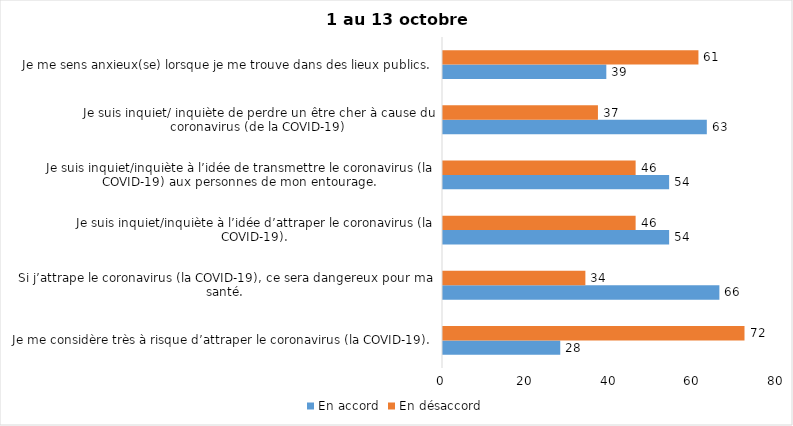
| Category | En accord | En désaccord |
|---|---|---|
| Je me considère très à risque d’attraper le coronavirus (la COVID-19). | 28 | 72 |
| Si j’attrape le coronavirus (la COVID-19), ce sera dangereux pour ma santé. | 66 | 34 |
| Je suis inquiet/inquiète à l’idée d’attraper le coronavirus (la COVID-19). | 54 | 46 |
| Je suis inquiet/inquiète à l’idée de transmettre le coronavirus (la COVID-19) aux personnes de mon entourage. | 54 | 46 |
| Je suis inquiet/ inquiète de perdre un être cher à cause du coronavirus (de la COVID-19) | 63 | 37 |
| Je me sens anxieux(se) lorsque je me trouve dans des lieux publics. | 39 | 61 |